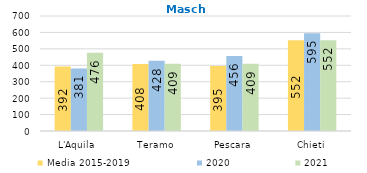
| Category | Media 2015-2019  | 2020 | 2021 |
|---|---|---|---|
| L'Aquila | 392 | 381 | 476 |
| Teramo | 407.6 | 428 | 409 |
| Pescara | 395.2 | 456 | 409 |
| Chieti | 552.2 | 595 | 552 |